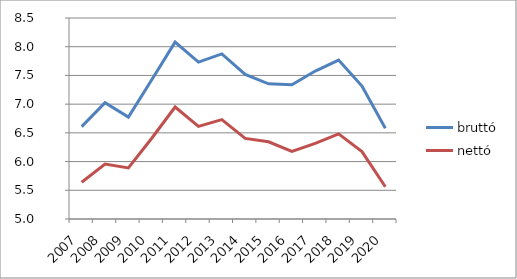
| Category | bruttó | nettó |
|---|---|---|
| 2007.0 | 6.609 | 5.64 |
| 2008.0 | 7.024 | 5.957 |
| 2009.0 | 6.774 | 5.89 |
| 2010.0 | 7.424 | 6.406 |
| 2011.0 | 8.08 | 6.95 |
| 2012.0 | 7.732 | 6.611 |
| 2013.0 | 7.875 | 6.731 |
| 2014.0 | 7.517 | 6.404 |
| 2015.0 | 7.354 | 6.345 |
| 2016.0 | 7.338 | 6.176 |
| 2017.0 | 7.576 | 6.317 |
| 2018.0 | 7.767 | 6.481 |
| 2019.0 | 7.315 | 6.174 |
| 2020.0 | 6.58 | 5.561 |